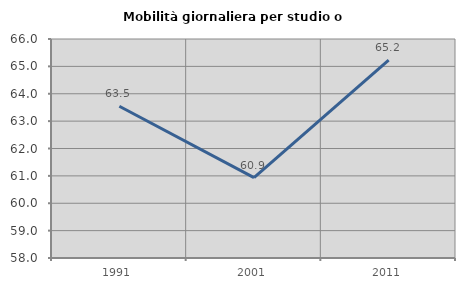
| Category | Mobilità giornaliera per studio o lavoro |
|---|---|
| 1991.0 | 63.545 |
| 2001.0 | 60.936 |
| 2011.0 | 65.225 |